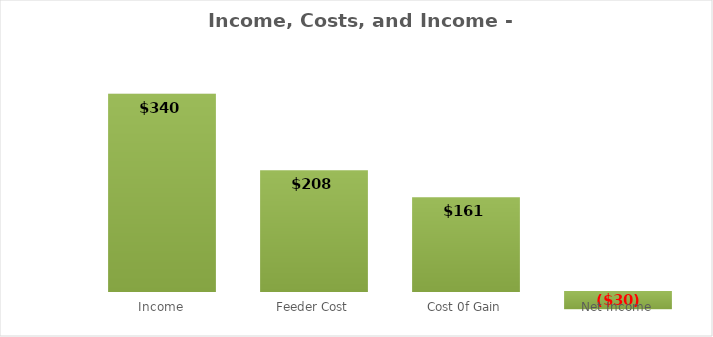
| Category |  $/Head |
|---|---|
| Income | 340 |
| Feeder Cost | 208.33 |
| Cost 0f Gain | 161.466 |
| Net Income | -29.796 |